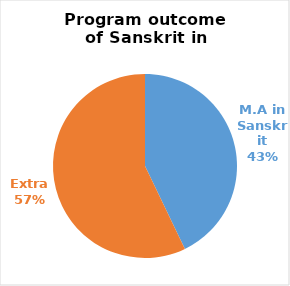
| Category | Series 0 |
|---|---|
| M.A in Sanskrit | 9 |
| Extra | 12 |